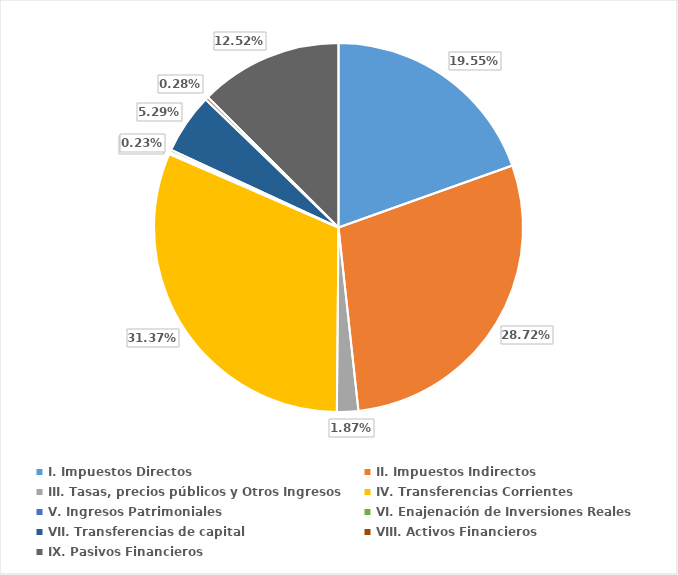
| Category | Series 0 |
|---|---|
| I. Impuestos Directos   | 0.195 |
| II. Impuestos Indirectos   | 0.287 |
| III. Tasas, precios públicos y Otros Ingresos   | 0.019 |
| IV. Transferencias Corrientes  | 0.314 |
| V. Ingresos Patrimoniales   | 0.002 |
| VI. Enajenación de Inversiones Reales   | 0.002 |
| VII. Transferencias de capital   | 0.053 |
| VIII. Activos Financieros   | 0.003 |
| IX. Pasivos Financieros | 0.125 |